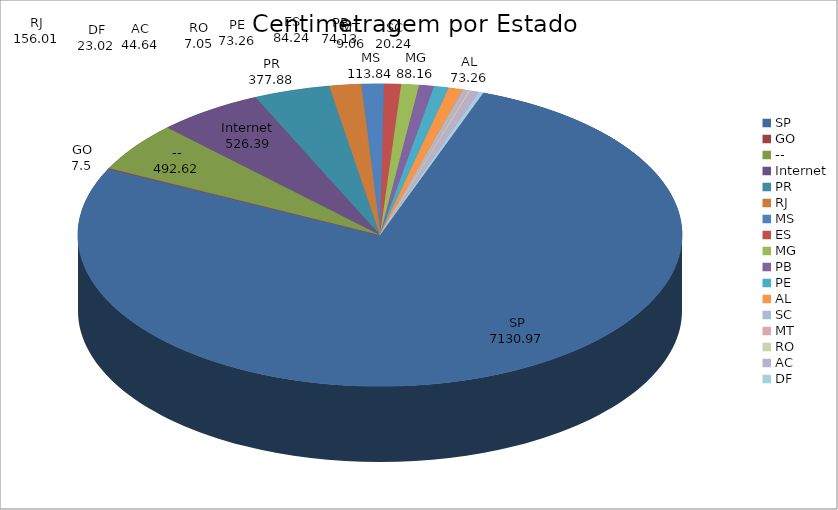
| Category | Series 0 |
|---|---|
| SP | 7130.97 |
| GO | 7.5 |
| -- | 492.62 |
| Internet | 526.39 |
| PR | 377.88 |
| RJ | 156.01 |
| MS | 113.84 |
| ES | 84.24 |
| MG | 88.16 |
| PB | 74.13 |
| PE | 73.26 |
| AL | 73.26 |
| SC | 20.24 |
| MT | 9.06 |
| RO | 7.05 |
| AC | 44.64 |
| DF | 23.02 |